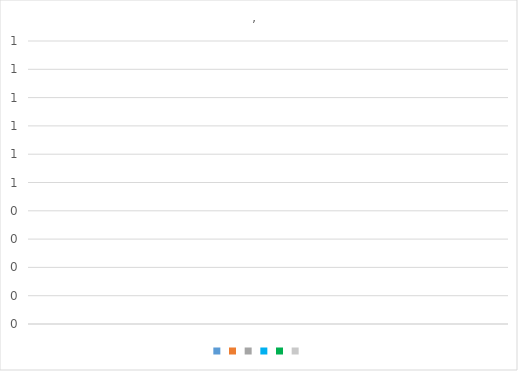
| Category | Series 0 | Series 1 | Series 2 | Series 3 | Series 4 | Series 5 |
|---|---|---|---|---|---|---|
| 0 | 0 | 0 | 0 | 0 | 0 | 0 |
| 1 | 0 | 0 | 0 | 0 | 0 | 0 |